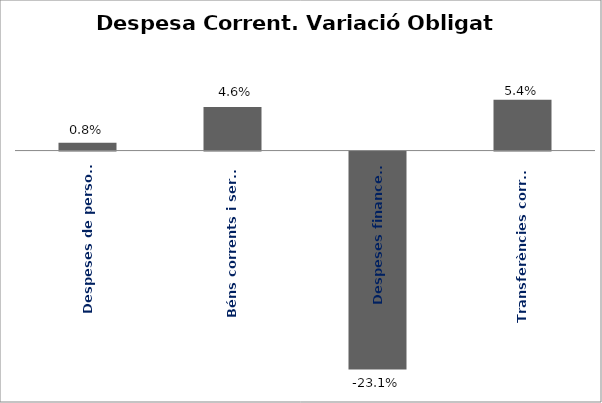
| Category | Series 0 |
|---|---|
| Despeses de personal | 0.008 |
| Béns corrents i serveis | 0.046 |
| Despeses financeres | -0.231 |
| Transferències corrents | 0.054 |